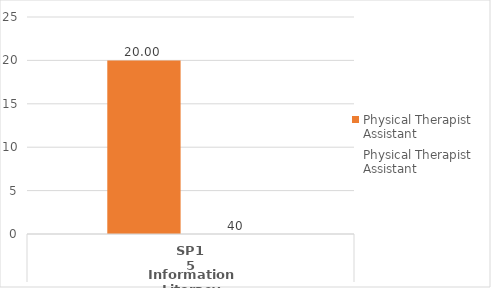
| Category | Average of outcome score - Physical Therapist Assistant | Count of outcome score - Physical Therapist Assistant |
|---|---|---|
| 0 | 20 | 40 |